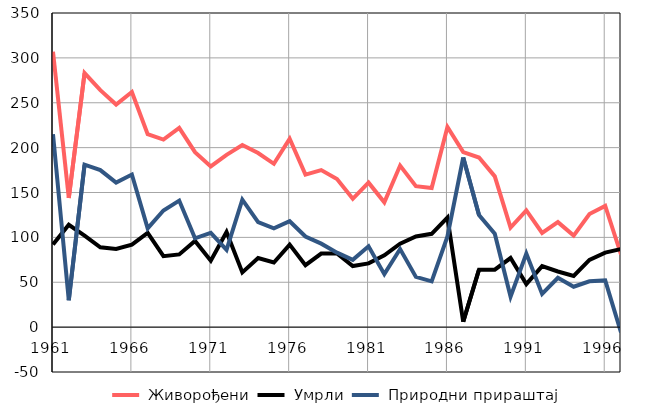
| Category |  Живорођени |  Умрли |  Природни прираштај |
|---|---|---|---|
| 1961.0 | 307 | 92 | 215 |
| 1962.0 | 144 | 114 | 30 |
| 1963.0 | 283 | 102 | 181 |
| 1964.0 | 264 | 89 | 175 |
| 1965.0 | 248 | 87 | 161 |
| 1966.0 | 262 | 92 | 170 |
| 1967.0 | 215 | 105 | 110 |
| 1968.0 | 209 | 79 | 130 |
| 1969.0 | 222 | 81 | 141 |
| 1970.0 | 195 | 96 | 99 |
| 1971.0 | 179 | 74 | 105 |
| 1972.0 | 192 | 106 | 86 |
| 1973.0 | 203 | 61 | 142 |
| 1974.0 | 194 | 77 | 117 |
| 1975.0 | 182 | 72 | 110 |
| 1976.0 | 210 | 92 | 118 |
| 1977.0 | 170 | 69 | 101 |
| 1978.0 | 175 | 82 | 93 |
| 1979.0 | 165 | 82 | 83 |
| 1980.0 | 143 | 68 | 75 |
| 1981.0 | 161 | 71 | 90 |
| 1982.0 | 139 | 80 | 59 |
| 1983.0 | 180 | 93 | 87 |
| 1984.0 | 157 | 101 | 56 |
| 1985.0 | 155 | 104 | 51 |
| 1986.0 | 223 | 122 | 101 |
| 1987.0 | 195 | 6 | 189 |
| 1988.0 | 189 | 64 | 125 |
| 1989.0 | 168 | 64 | 104 |
| 1990.0 | 111 | 77 | 34 |
| 1991.0 | 130 | 48 | 82 |
| 1992.0 | 105 | 68 | 37 |
| 1993.0 | 117 | 62 | 55 |
| 1994.0 | 102 | 57 | 45 |
| 1995.0 | 126 | 75 | 51 |
| 1996.0 | 135 | 83 | 52 |
| 1997.0 | 81 | 87 | -6 |